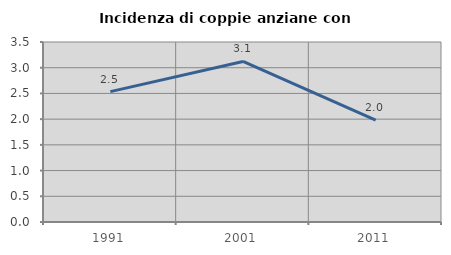
| Category | Incidenza di coppie anziane con figli |
|---|---|
| 1991.0 | 2.535 |
| 2001.0 | 3.122 |
| 2011.0 | 1.979 |